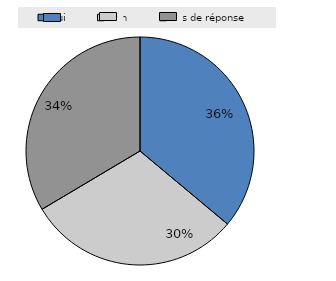
| Category | Series 0 |
|---|---|
| Oui | 0.361 |
| Non | 0.304 |
| Pas de réponse | 0.335 |